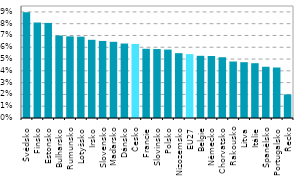
| Category | Series 0 |
|---|---|
| Švédsko | 0.09 |
| Finsko | 0.081 |
| Estonsko | 0.081 |
| Bulharsko | 0.07 |
| Rumunsko | 0.069 |
| Lotyšsko | 0.069 |
| Irsko | 0.066 |
| Slovensko | 0.065 |
| Maďarsko | 0.065 |
| Dánsko | 0.063 |
| Česko | 0.063 |
| Francie | 0.059 |
| Slovinsko | 0.058 |
| Polsko | 0.058 |
| Nizozemsko | 0.055 |
| EU27 | 0.054 |
| Belgie | 0.053 |
| Německo | 0.053 |
| Chorvatsko | 0.052 |
| Rakousko | 0.048 |
| Litva | 0.047 |
| Itálie | 0.046 |
| Španělsko | 0.043 |
| Portugalsko | 0.043 |
| Řecko | 0.02 |